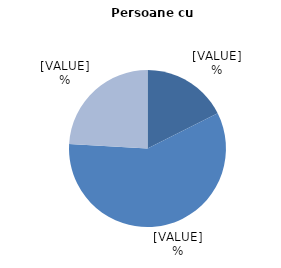
| Category | Persoane cu dizabilități |
|---|---|
| Ocupații cu calificare înată | 17.6 |
| Ocupații cu calificare medie | 58.3 |
| Ocupații cu calificare joasă | 24.1 |